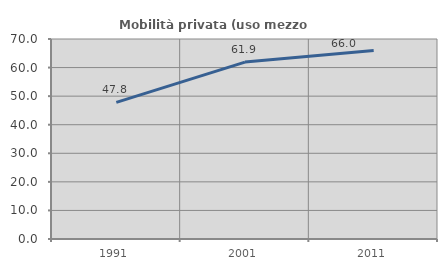
| Category | Mobilità privata (uso mezzo privato) |
|---|---|
| 1991.0 | 47.838 |
| 2001.0 | 61.919 |
| 2011.0 | 65.957 |